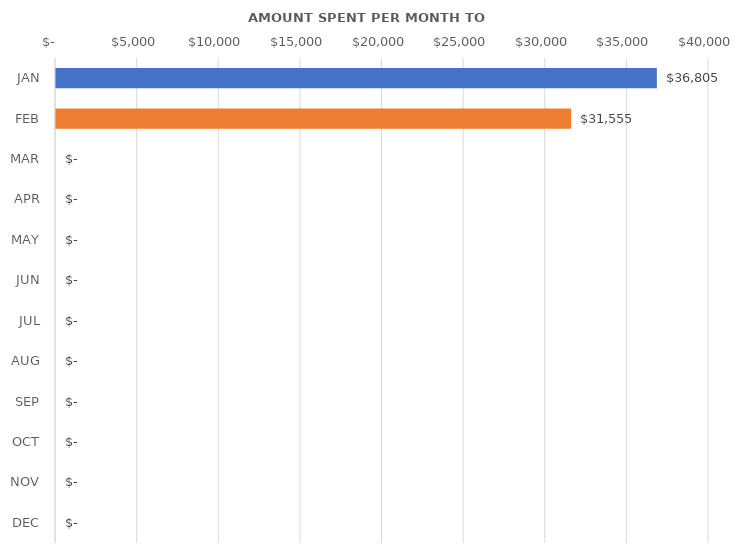
| Category | Series 0 |
|---|---|
| JAN | 36805 |
| FEB | 31555 |
| MAR | 0 |
| APR | 0 |
| MAY | 0 |
| JUN | 0 |
| JUL | 0 |
| AUG | 0 |
| SEP | 0 |
| OCT | 0 |
| NOV | 0 |
| DEC | 0 |